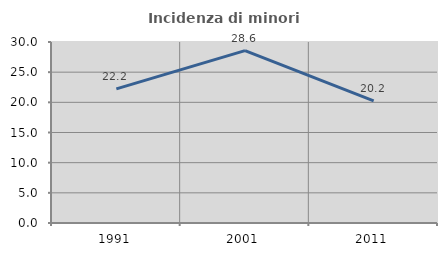
| Category | Incidenza di minori stranieri |
|---|---|
| 1991.0 | 22.222 |
| 2001.0 | 28.571 |
| 2011.0 | 20.225 |